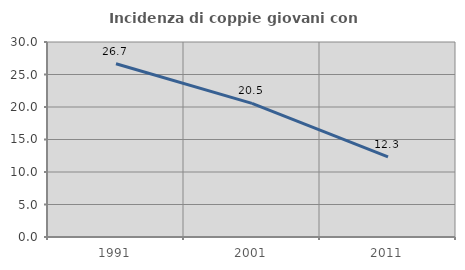
| Category | Incidenza di coppie giovani con figli |
|---|---|
| 1991.0 | 26.652 |
| 2001.0 | 20.55 |
| 2011.0 | 12.321 |